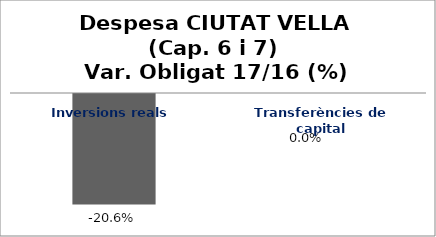
| Category | Series 0 |
|---|---|
| Inversions reals | -0.206 |
| Transferències de capital | 0 |